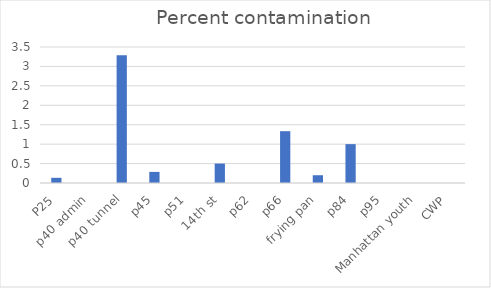
| Category | Percent R contamination |
|---|---|
| P25 | 0.133 |
| p40 admin | 0 |
| p40 tunnel | 3.29 |
| p45 | 0.286 |
| p51 | 0 |
| 14th st | 0.5 |
| p62 | 0 |
| p66 | 1.333 |
| frying pan | 0.2 |
| p84 | 1 |
| p95 | 0 |
| Manhattan youth | 0 |
| CWP | 0 |